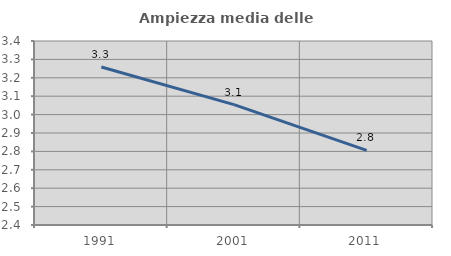
| Category | Ampiezza media delle famiglie |
|---|---|
| 1991.0 | 3.259 |
| 2001.0 | 3.054 |
| 2011.0 | 2.806 |